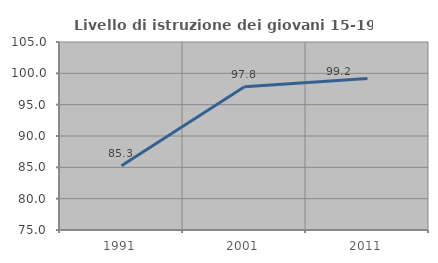
| Category | Livello di istruzione dei giovani 15-19 anni |
|---|---|
| 1991.0 | 85.251 |
| 2001.0 | 97.846 |
| 2011.0 | 99.176 |